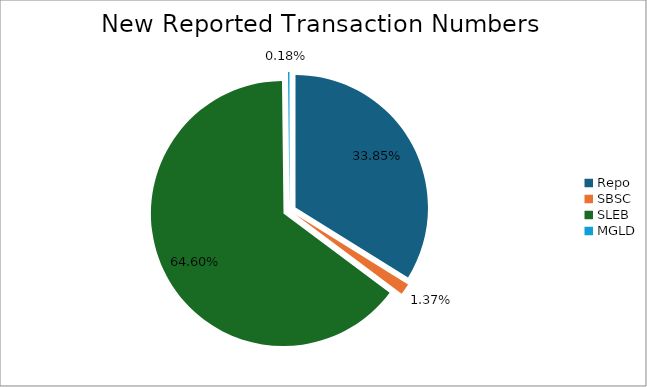
| Category | Series 0 |
|---|---|
| Repo | 468299 |
| SBSC | 18935 |
| SLEB | 893858 |
| MGLD | 2528 |